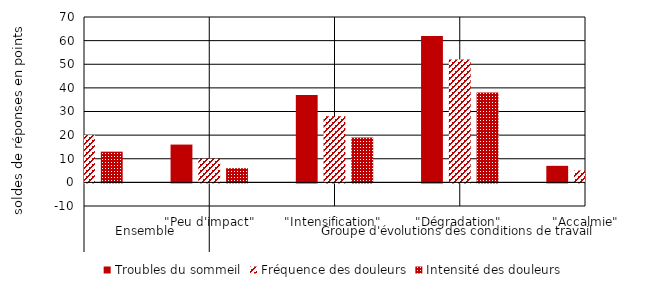
| Category | Troubles du sommeil | Fréquence des douleurs | Intensité des douleurs |
|---|---|---|---|
| 0 | 27 | 20 | 13 |
| 1 | 16 | 10 | 6 |
| 2 | 37 | 28 | 19 |
| 3 | 62 | 52 | 38 |
| 4 | 7 | 5 | -2 |